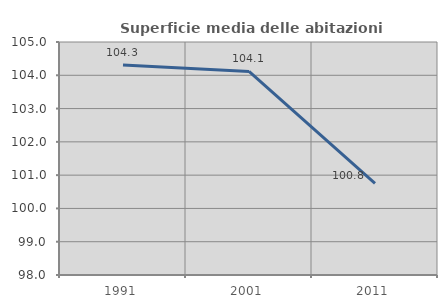
| Category | Superficie media delle abitazioni occupate |
|---|---|
| 1991.0 | 104.306 |
| 2001.0 | 104.117 |
| 2011.0 | 100.752 |